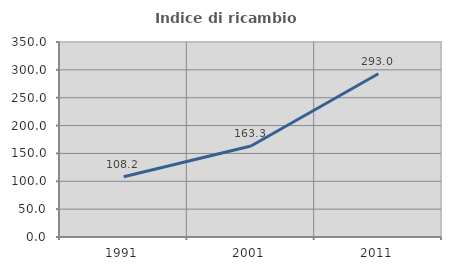
| Category | Indice di ricambio occupazionale  |
|---|---|
| 1991.0 | 108.23 |
| 2001.0 | 163.285 |
| 2011.0 | 293.023 |